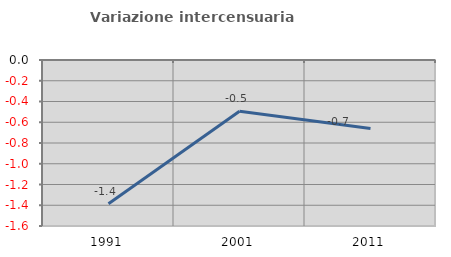
| Category | Variazione intercensuaria annua |
|---|---|
| 1991.0 | -1.386 |
| 2001.0 | -0.493 |
| 2011.0 | -0.659 |